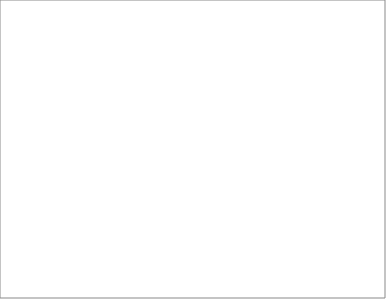
| Category | 2004 | 2005 | 2006 | 2008 | 2009 | 2010 | 2011 | 2012 | 2013 |
|---|---|---|---|---|---|---|---|---|---|
| dolnośląskie |  |  | 23 | 41 | 41 | 42 |  | 22 | 15 |